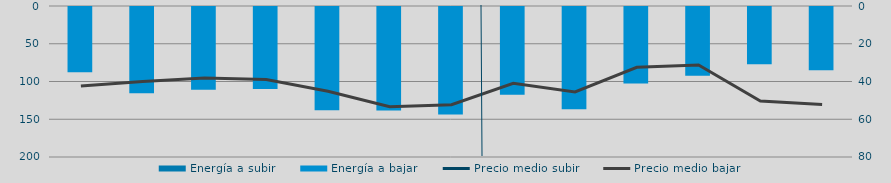
| Category | Energía a subir | Energía a bajar |
|---|---|---|
| D |  | 87837.741 |
| E |  | 115472.265 |
| F |  | 110945.08 |
| M |  | 109933.033 |
| A |  | 138127.981 |
| M |  | 138345.883 |
| J |  | 143556.525 |
| J |  | 117527.055 |
| A |  | 136637.182 |
| S |  | 102576.868 |
| O |  | 92295.144 |
| N |  | 77249.593 |
| D |  | 84958.21 |